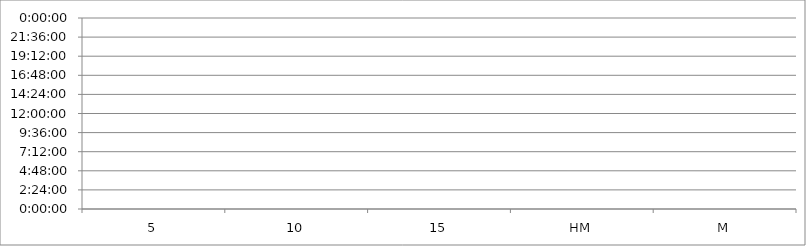
| Category | Series 0 |
|---|---|
| 5 | 0 |
| 10 | 0 |
| 15 | 0 |
| HM | 0 |
| M | 0 |